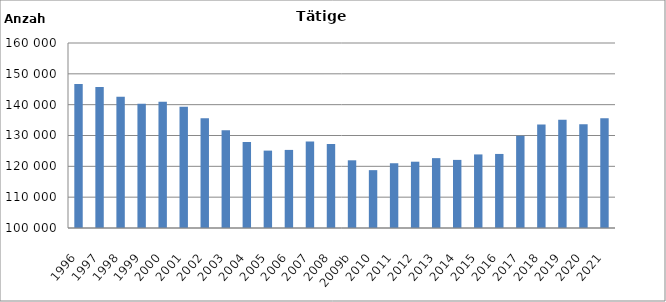
| Category | Series 0 |
|---|---|
| 1996 | 146742 |
| 1997 | 145717 |
| 1998 | 142598 |
| 1999 | 140319 |
| 2000 | 140983 |
| 2001 | 139341 |
| 2002 | 135596 |
| 2003 | 131743 |
| 2004 | 127904 |
| 2005 | 125099 |
| 2006 | 125327 |
| 2007 | 128030 |
| 2008 | 127238 |
| 2009b | 121954 |
| 2010 | 118762 |
| 2011 | 121003 |
| 2012 | 121500 |
| 2013 | 122658 |
| 2014 | 122086 |
| 2015 | 123861 |
| 2016 | 124018 |
| 2017 | 129935 |
| 2018 | 133536 |
| 2019 | 135140 |
| 2020 | 133658 |
| 2021 | 135579 |